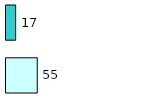
| Category | Series 0 | Series 1 |
|---|---|---|
| 0 | 55 | 17 |